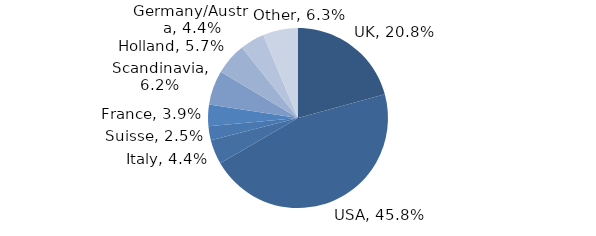
| Category | Investment Style |
|---|---|
| UK | 0.208 |
| USA | 0.458 |
| Italy | 0.044 |
| Suisse | 0.025 |
| France | 0.039 |
| Scandinavia | 0.062 |
| Holland | 0.057 |
| Germany/Austria | 0.044 |
| Other | 0.063 |